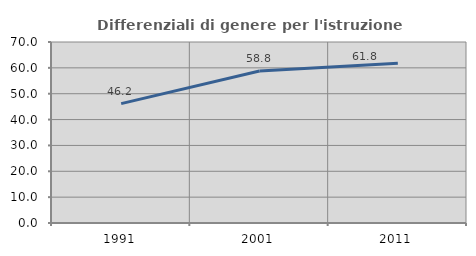
| Category | Differenziali di genere per l'istruzione superiore |
|---|---|
| 1991.0 | 46.154 |
| 2001.0 | 58.777 |
| 2011.0 | 61.754 |